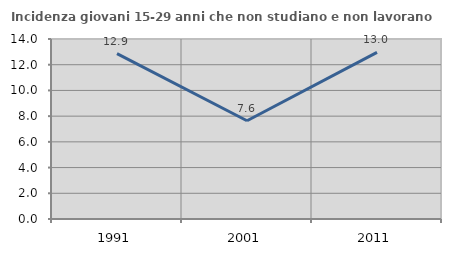
| Category | Incidenza giovani 15-29 anni che non studiano e non lavorano  |
|---|---|
| 1991.0 | 12.86 |
| 2001.0 | 7.642 |
| 2011.0 | 12.962 |